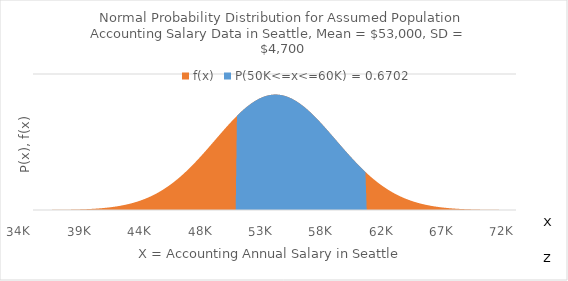
| Category | f(x) |
|---|---|
| 34K | 0 |
|  | 0 |
|  | 0 |
|  | 0 |
|  | 0 |
|  | 0 |
|  | 0 |
|  | 0 |
|  | 0 |
|  | 0 |
|  | 0 |
|  | 0 |
|  | 0 |
|  | 0 |
|  | 0 |
|  | 0 |
|  | 0 |
|  | 0 |
|  | 0 |
|  | 0 |
|  | 0 |
|  | 0 |
|  | 0 |
|  | 0 |
|  | 0 |
|  | 0 |
|  | 0 |
|  | 0 |
|  | 0 |
|  | 0 |
|  | 0 |
|  | 0 |
|  | 0 |
|  | 0 |
|  | 0 |
|  | 0 |
|  | 0 |
|  | 0 |
|  | 0 |
|  | 0 |
|  | 0 |
|  | 0 |
|  | 0 |
|  | 0 |
|  | 0 |
|  | 0 |
|  | 0 |
| 39K | 0 |
|  | 0 |
|  | 0 |
|  | 0 |
|  | 0 |
|  | 0 |
|  | 0 |
|  | 0 |
|  | 0 |
|  | 0 |
|  | 0 |
|  | 0 |
|  | 0 |
|  | 0 |
|  | 0 |
|  | 0 |
|  | 0 |
|  | 0 |
|  | 0 |
|  | 0 |
|  | 0 |
|  | 0 |
|  | 0 |
|  | 0 |
|  | 0 |
|  | 0 |
|  | 0 |
|  | 0 |
|  | 0 |
|  | 0 |
|  | 0 |
|  | 0 |
|  | 0 |
|  | 0 |
|  | 0 |
|  | 0 |
|  | 0 |
|  | 0 |
|  | 0 |
|  | 0 |
|  | 0 |
|  | 0 |
|  | 0 |
|  | 0 |
|  | 0 |
|  | 0 |
|  | 0 |
| 44K | 0 |
|  | 0 |
|  | 0 |
|  | 0 |
|  | 0 |
|  | 0 |
|  | 0 |
|  | 0 |
|  | 0 |
|  | 0 |
|  | 0 |
|  | 0 |
|  | 0 |
|  | 0 |
|  | 0 |
|  | 0 |
|  | 0 |
|  | 0 |
|  | 0 |
|  | 0 |
|  | 0 |
|  | 0 |
|  | 0 |
|  | 0 |
|  | 0 |
|  | 0 |
|  | 0 |
|  | 0 |
|  | 0 |
|  | 0 |
|  | 0 |
|  | 0 |
|  | 0 |
|  | 0 |
|  | 0 |
|  | 0 |
|  | 0 |
|  | 0 |
|  | 0 |
|  | 0 |
|  | 0 |
|  | 0 |
|  | 0 |
|  | 0 |
|  | 0 |
|  | 0 |
|  | 0 |
| 48K | 0 |
|  | 0 |
|  | 0 |
|  | 0 |
|  | 0 |
|  | 0 |
|  | 0 |
|  | 0 |
|  | 0 |
|  | 0 |
|  | 0 |
|  | 0 |
|  | 0 |
|  | 0 |
|  | 0 |
|  | 0 |
|  | 0 |
|  | 0 |
|  | 0 |
|  | 0 |
|  | 0 |
|  | 0 |
|  | 0 |
|  | 0 |
|  | 0 |
|  | 0 |
|  | 0 |
|  | 0 |
|  | 0 |
|  | 0 |
|  | 0 |
|  | 0 |
|  | 0 |
|  | 0 |
|  | 0 |
|  | 0 |
|  | 0 |
|  | 0 |
|  | 0 |
|  | 0 |
|  | 0 |
|  | 0 |
|  | 0 |
|  | 0 |
|  | 0 |
|  | 0 |
|  | 0 |
| 53K | 0 |
|  | 0 |
|  | 0 |
|  | 0 |
|  | 0 |
|  | 0 |
|  | 0 |
|  | 0 |
|  | 0 |
|  | 0 |
|  | 0 |
|  | 0 |
|  | 0 |
|  | 0 |
|  | 0 |
|  | 0 |
|  | 0 |
|  | 0 |
|  | 0 |
|  | 0 |
|  | 0 |
|  | 0 |
|  | 0 |
|  | 0 |
|  | 0 |
|  | 0 |
|  | 0 |
|  | 0 |
|  | 0 |
|  | 0 |
|  | 0 |
|  | 0 |
|  | 0 |
|  | 0 |
|  | 0 |
|  | 0 |
|  | 0 |
|  | 0 |
|  | 0 |
|  | 0 |
|  | 0 |
|  | 0 |
|  | 0 |
|  | 0 |
|  | 0 |
|  | 0 |
|  | 0 |
| 58K | 0 |
|  | 0 |
|  | 0 |
|  | 0 |
|  | 0 |
|  | 0 |
|  | 0 |
|  | 0 |
|  | 0 |
|  | 0 |
|  | 0 |
|  | 0 |
|  | 0 |
|  | 0 |
|  | 0 |
|  | 0 |
|  | 0 |
|  | 0 |
|  | 0 |
|  | 0 |
|  | 0 |
|  | 0 |
|  | 0 |
|  | 0 |
|  | 0 |
|  | 0 |
|  | 0 |
|  | 0 |
|  | 0 |
|  | 0 |
|  | 0 |
|  | 0 |
|  | 0 |
|  | 0 |
|  | 0 |
|  | 0 |
|  | 0 |
|  | 0 |
|  | 0 |
|  | 0 |
|  | 0 |
|  | 0 |
|  | 0 |
|  | 0 |
|  | 0 |
|  | 0 |
|  | 0 |
| 62K | 0 |
|  | 0 |
|  | 0 |
|  | 0 |
|  | 0 |
|  | 0 |
|  | 0 |
|  | 0 |
|  | 0 |
|  | 0 |
|  | 0 |
|  | 0 |
|  | 0 |
|  | 0 |
|  | 0 |
|  | 0 |
|  | 0 |
|  | 0 |
|  | 0 |
|  | 0 |
|  | 0 |
|  | 0 |
|  | 0 |
|  | 0 |
|  | 0 |
|  | 0 |
|  | 0 |
|  | 0 |
|  | 0 |
|  | 0 |
|  | 0 |
|  | 0 |
|  | 0 |
|  | 0 |
|  | 0 |
|  | 0 |
|  | 0 |
|  | 0 |
|  | 0 |
|  | 0 |
|  | 0 |
|  | 0 |
|  | 0 |
|  | 0 |
|  | 0 |
|  | 0 |
|  | 0 |
| 67K | 0 |
|  | 0 |
|  | 0 |
|  | 0 |
|  | 0 |
|  | 0 |
|  | 0 |
|  | 0 |
|  | 0 |
|  | 0 |
|  | 0 |
|  | 0 |
|  | 0 |
|  | 0 |
|  | 0 |
|  | 0 |
|  | 0 |
|  | 0 |
|  | 0 |
|  | 0 |
|  | 0 |
|  | 0 |
|  | 0 |
|  | 0 |
|  | 0 |
|  | 0 |
|  | 0 |
|  | 0 |
|  | 0 |
|  | 0 |
|  | 0 |
|  | 0 |
|  | 0 |
|  | 0 |
|  | 0 |
|  | 0 |
|  | 0 |
|  | 0 |
|  | 0 |
|  | 0 |
|  | 0 |
|  | 0 |
|  | 0 |
|  | 0 |
|  | 0 |
|  | 0 |
|  | 0 |
| 72K | 0 |